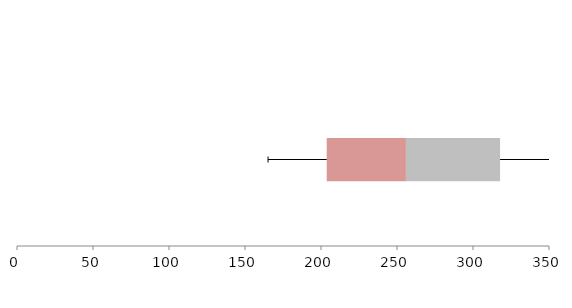
| Category | Series 1 | Series 2 | Series 3 |
|---|---|---|---|
| 0 | 203.765 | 52.114 | 61.935 |